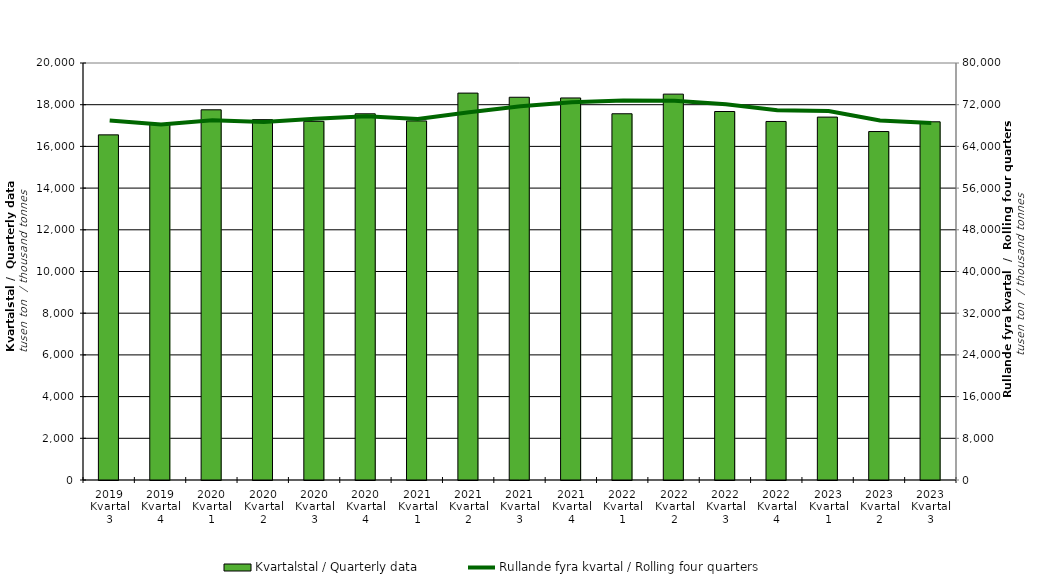
| Category | Kvartalstal / Quarterly data |
|---|---|
| 2019 Kvartal 3 | 16553.159 |
| 2019 Kvartal 4 | 17080.691 |
| 2020 Kvartal 1 | 17755.324 |
| 2020 Kvartal 2 | 17283.081 |
| 2020 Kvartal 3 | 17203.185 |
| 2020 Kvartal 4 | 17563.403 |
| 2021 Kvartal 1 | 17221.505 |
| 2021 Kvartal 2 | 18556.292 |
| 2021 Kvartal 3 | 18357.009 |
| 2021 Kvartal 4 | 18323.49 |
| 2022 Kvartal 1 | 17565.59 |
| 2022 Kvartal 2 | 18506.797 |
| 2022 Kvartal 3 | 17673.481 |
| 2022 Kvartal 4 | 17195.877 |
| 2023 Kvartal 1 | 17405.178 |
| 2023 Kvartal 2 | 16712.409 |
| 2023 Kvartal 3 | 17180.586 |